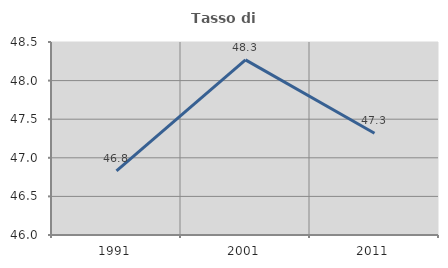
| Category | Tasso di occupazione   |
|---|---|
| 1991.0 | 46.832 |
| 2001.0 | 48.268 |
| 2011.0 | 47.318 |